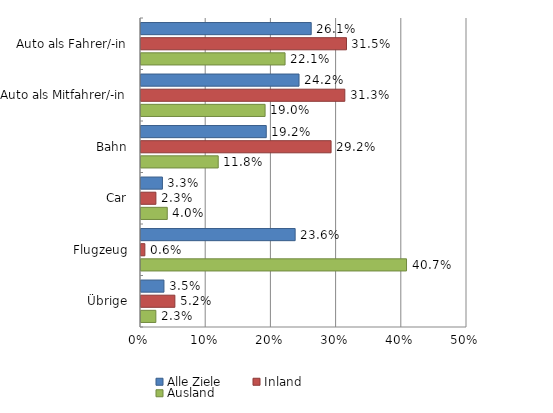
| Category | Alle Ziele | Inland | Ausland |
|---|---|---|---|
| Auto als Fahrer/-in | 26.105 | 31.516 | 22.095 |
| Auto als Mitfahrer/-in | 24.236 | 31.26 | 19.03 |
| Bahn | 19.211 | 29.152 | 11.844 |
| Car | 3.286 | 2.285 | 4.028 |
| Flugzeug | 23.642 | 0.592 | 40.723 |
| Übrige | 3.52 | 5.195 | 2.278 |